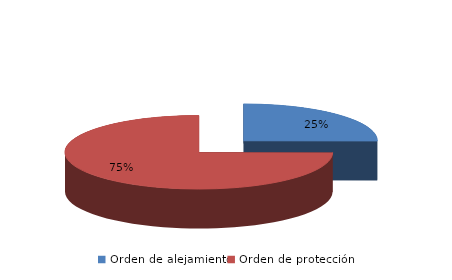
| Category | Series 0 |
|---|---|
| Orden de alejamiento | 248 |
| Orden de protección | 741 |